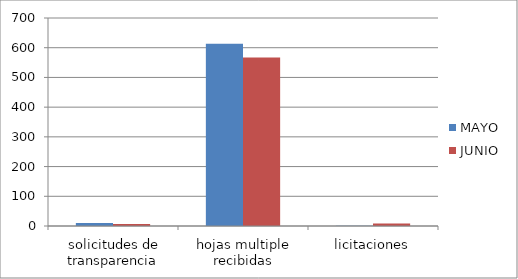
| Category | MAYO | JUNIO |
|---|---|---|
| solicitudes de transparencia | 10 | 7 |
| hojas multiple recibidas | 613 | 567 |
| licitaciones | 1 | 8 |